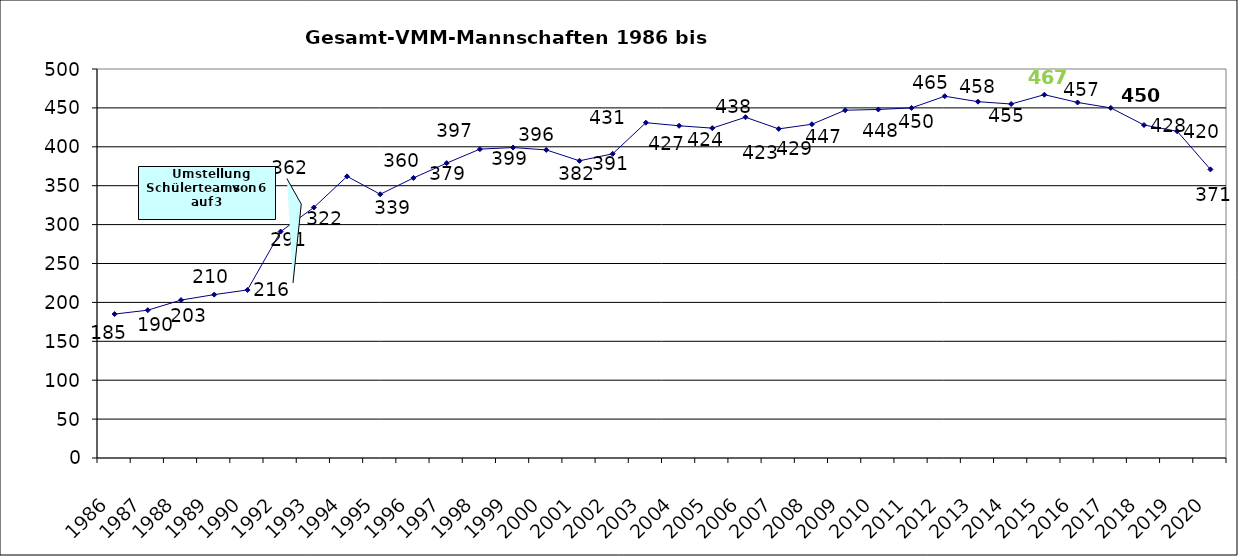
| Category | Gesamt |
|---|---|
| 1986.0 | 185 |
| 1987.0 | 190 |
| 1988.0 | 203 |
| 1989.0 | 210 |
| 1990.0 | 216 |
| 1992.0 | 291 |
| 1993.0 | 322 |
| 1994.0 | 362 |
| 1995.0 | 339 |
| 1996.0 | 360 |
| 1997.0 | 379 |
| 1998.0 | 397 |
| 1999.0 | 399 |
| 2000.0 | 396 |
| 2001.0 | 382 |
| 2002.0 | 391 |
| 2003.0 | 431 |
| 2004.0 | 427 |
| 2005.0 | 424 |
| 2006.0 | 438 |
| 2007.0 | 423 |
| 2008.0 | 429 |
| 2009.0 | 447 |
| 2010.0 | 448 |
| 2011.0 | 450 |
| 2012.0 | 465 |
| 2013.0 | 458 |
| 2014.0 | 455 |
| 2015.0 | 467 |
| 2016.0 | 457 |
| 2017.0 | 450 |
| 2018.0 | 428 |
| 2019.0 | 420 |
| 2020.0 | 371 |